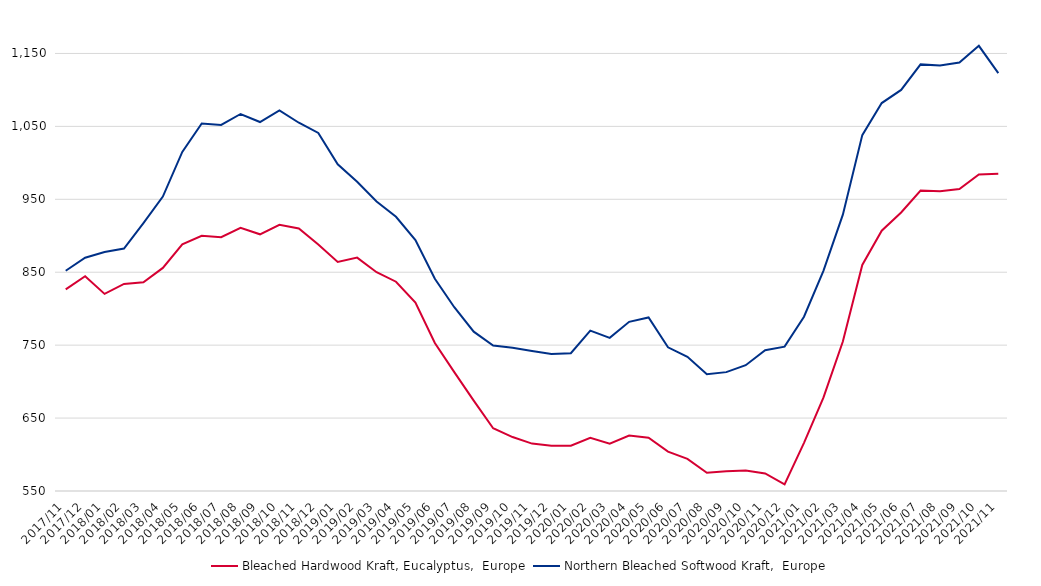
| Category | Bleached Hardwood Kraft, Eucalyptus,  Europe | Northern Bleached Softwood Kraft,  Europe |
|---|---|---|
| 2017/11 | 826.51 | 852.08 |
| 2017/12 | 844.62 | 869.96 |
| 2018/01 | 820.28 | 877.7 |
| 2018/02 | 833.97 | 882.55 |
| 2018/03 | 836.17 | 917.35 |
| 2018/04 | 855.92 | 953.74 |
| 2018/05 | 888.17 | 1015.06 |
| 2018/06 | 900 | 1054 |
| 2018/07 | 898 | 1052 |
| 2018/08 | 911 | 1067 |
| 2018/09 | 902 | 1056 |
| 2018/10 | 915 | 1072 |
| 2018/11 | 910 | 1055 |
| 2018/12 | 888 | 1041 |
| 2019/01 | 864 | 998 |
| 2019/02 | 870 | 974 |
| 2019/03 | 850 | 947 |
| 2019/04 | 837 | 926 |
| 2019/05 | 808.5 | 894 |
| 2019/06 | 753 | 841 |
| 2019/07 | 713 | 802 |
| 2019/08 | 674 | 768.5 |
| 2019/09 | 636 | 749.5 |
| 2019/10 | 624 | 746.5 |
| 2019/11 | 615 | 742 |
| 2019/12 | 612 | 738 |
| 2020/01 | 612 | 739 |
| 2020/02 | 623 | 770 |
| 2020/03 | 615 | 760 |
| 2020/04 | 626 | 782 |
| 2020/05 | 623 | 788 |
| 2020/06 | 604 | 747 |
| 2020/07 | 594 | 734 |
| 2020/08 | 575 | 710 |
| 2020/09 | 577 | 713 |
| 2020/10 | 578 | 722.5 |
| 2020/11 | 574 | 743 |
| 2020/12 | 559 | 748 |
| 2021/01 | 616 | 789 |
| 2021/02 | 678 | 852 |
| 2021/03 | 755 | 929 |
| 2021/04 | 860 | 1038 |
| 2021/05 | 907 | 1082 |
| 2021/06 | 932 | 1100 |
| 2021/07 | 962 | 1135 |
| 2021/08 | 961 | 1133.5 |
| 2021/09 | 964 | 1137.5 |
| 2021/10 | 984 | 1160.5 |
| 2021/11 | 985 | 1123 |